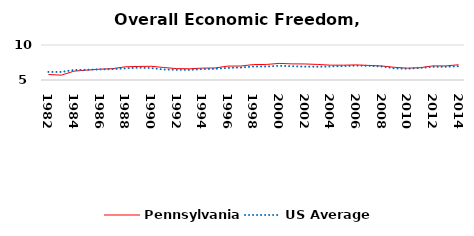
| Category | Pennsylvania | US Average |
|---|---|---|
| 1982.0 | 5.789 | 6.149 |
| 1983.0 | 5.691 | 6.152 |
| 1984.0 | 6.264 | 6.429 |
| 1985.0 | 6.415 | 6.464 |
| 1986.0 | 6.549 | 6.512 |
| 1987.0 | 6.622 | 6.552 |
| 1988.0 | 6.885 | 6.659 |
| 1989.0 | 6.936 | 6.767 |
| 1990.0 | 6.962 | 6.71 |
| 1991.0 | 6.786 | 6.502 |
| 1992.0 | 6.628 | 6.463 |
| 1993.0 | 6.601 | 6.446 |
| 1994.0 | 6.697 | 6.563 |
| 1995.0 | 6.718 | 6.593 |
| 1996.0 | 6.985 | 6.73 |
| 1997.0 | 6.997 | 6.781 |
| 1998.0 | 7.204 | 6.926 |
| 1999.0 | 7.22 | 6.925 |
| 2000.0 | 7.373 | 7.031 |
| 2001.0 | 7.301 | 6.969 |
| 2002.0 | 7.291 | 6.912 |
| 2003.0 | 7.223 | 6.892 |
| 2004.0 | 7.121 | 6.934 |
| 2005.0 | 7.118 | 6.99 |
| 2006.0 | 7.154 | 7.048 |
| 2007.0 | 7.082 | 7.028 |
| 2008.0 | 7.006 | 6.935 |
| 2009.0 | 6.811 | 6.668 |
| 2010.0 | 6.694 | 6.605 |
| 2011.0 | 6.76 | 6.72 |
| 2012.0 | 7.015 | 6.883 |
| 2013.0 | 7.01 | 6.881 |
| 2014.0 | 7.177 | 6.973 |